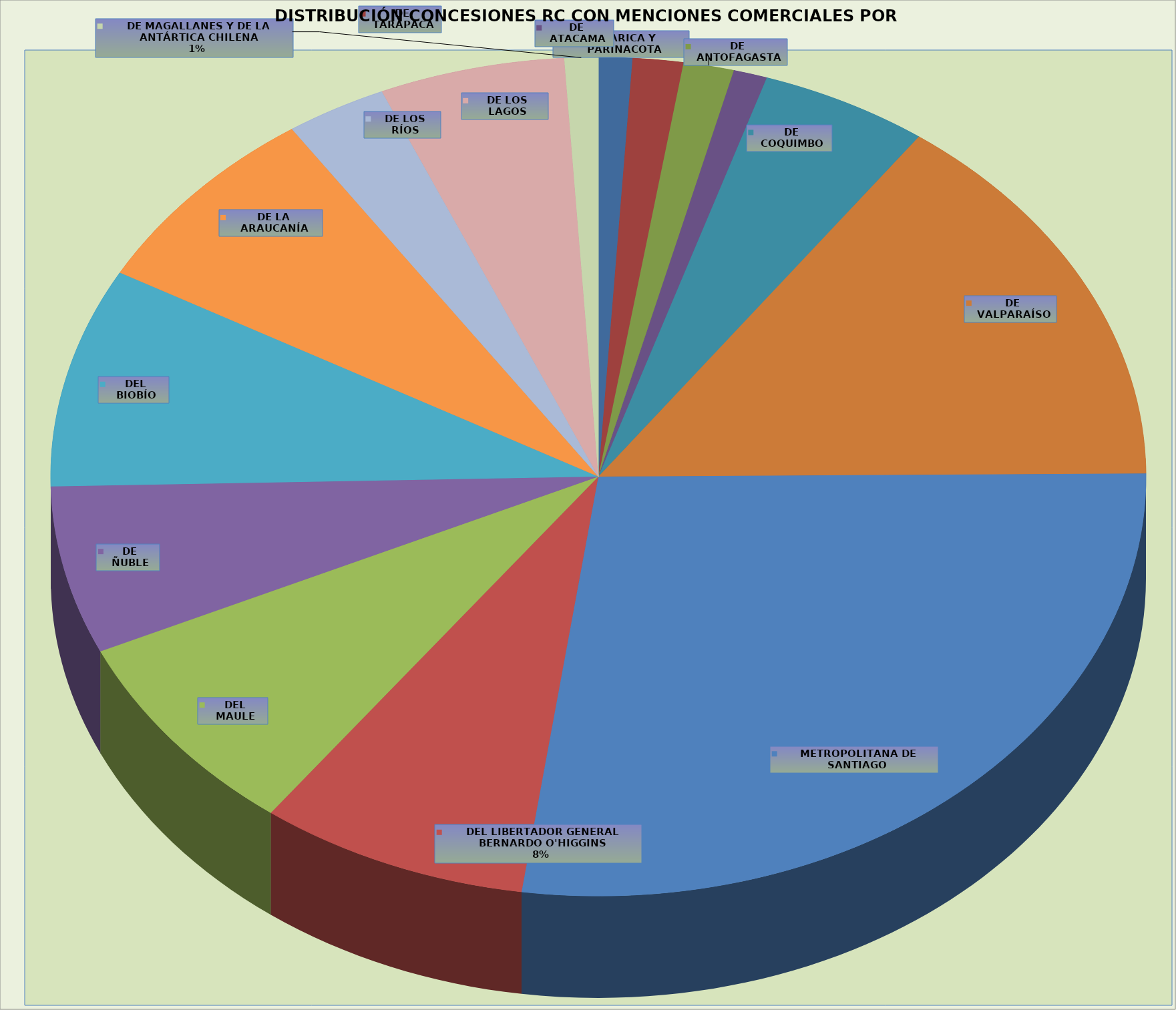
| Category | RC |
|---|---|
| DE ARICA Y PARINACOTA | 2 |
| DE TARAPACÁ | 3 |
| DE ANTOFAGASTA | 3 |
| DE ATACAMA | 2 |
| DE COQUIMBO | 10 |
| DE VALPARAÍSO | 30 |
| METROPOLITANA DE SANTIAGO | 55 |
| DEL LIBERTADOR GENERAL BERNARDO O'HIGGINS | 16 |
| DEL MAULE | 16 |
| DE ÑUBLE | 13 |
| DEL BIOBÍO | 17 |
| DE LA ARAUCANÍA | 15 |
| DE LOS RÍOS | 6 |
| DE LOS LAGOS | 11 |
| DE MAGALLANES Y DE LA ANTÁRTICA CHILENA | 2 |